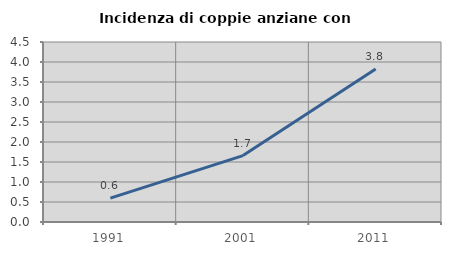
| Category | Incidenza di coppie anziane con figli |
|---|---|
| 1991.0 | 0.595 |
| 2001.0 | 1.66 |
| 2011.0 | 3.823 |